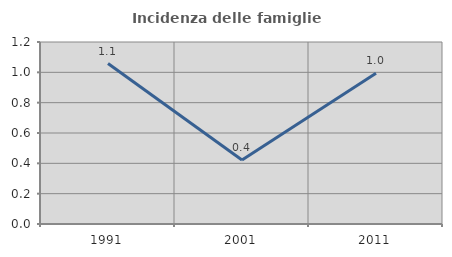
| Category | Incidenza delle famiglie numerose |
|---|---|
| 1991.0 | 1.058 |
| 2001.0 | 0.421 |
| 2011.0 | 0.994 |